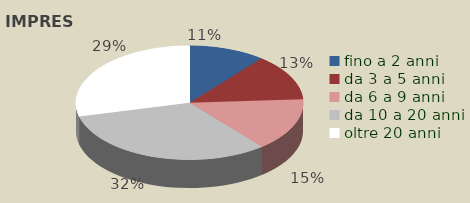
| Category | Series 0 |
|---|---|
| fino a 2 anni | 3810 |
| da 3 a 5 anni | 4635 |
| da 6 a 9 anni | 5286 |
| da 10 a 20 anni | 11280 |
| oltre 20 anni | 10178 |